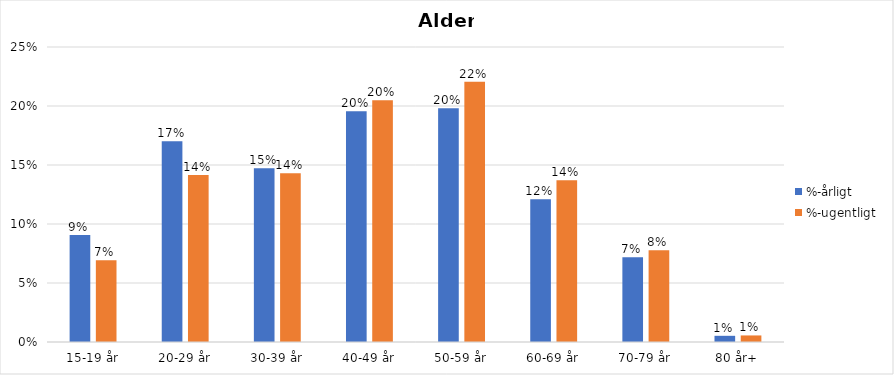
| Category | %-årligt | %-ugentligt |
|---|---|---|
| 15-19 år | 0.091 | 0.069 |
| 20-29 år | 0.17 | 0.142 |
| 30-39 år | 0.147 | 0.143 |
| 40-49 år | 0.196 | 0.205 |
| 50-59 år | 0.198 | 0.221 |
| 60-69 år | 0.121 | 0.137 |
| 70-79 år | 0.072 | 0.078 |
| 80 år+ | 0.005 | 0.006 |